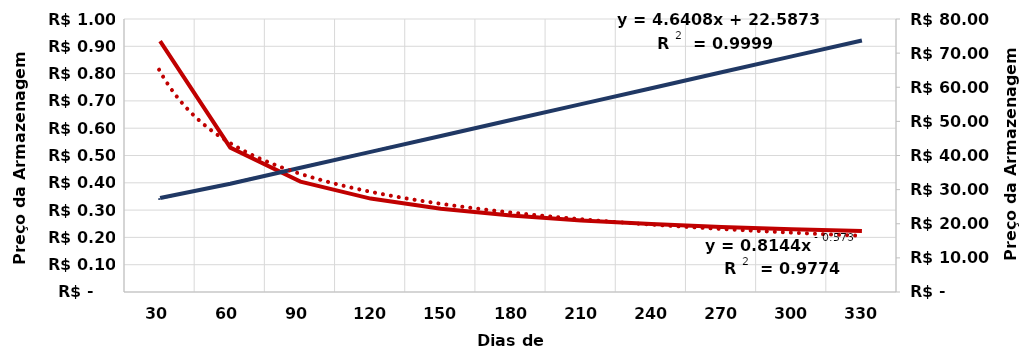
| Category | R$/t.dia |
|---|---|
| 30.0 | 0.919 |
| 60.0 | 0.529 |
| 90.0 | 0.404 |
| 120.0 | 0.342 |
| 150.0 | 0.305 |
| 180.0 | 0.28 |
| 210.0 | 0.262 |
| 240.0 | 0.249 |
| 270.0 | 0.238 |
| 300.0 | 0.23 |
| 330.0 | 0.223 |